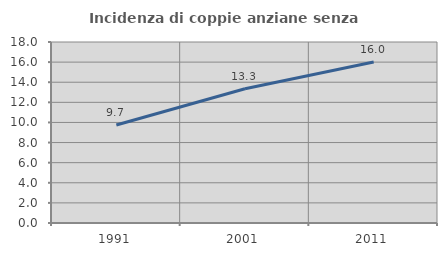
| Category | Incidenza di coppie anziane senza figli  |
|---|---|
| 1991.0 | 9.745 |
| 2001.0 | 13.349 |
| 2011.0 | 16.003 |